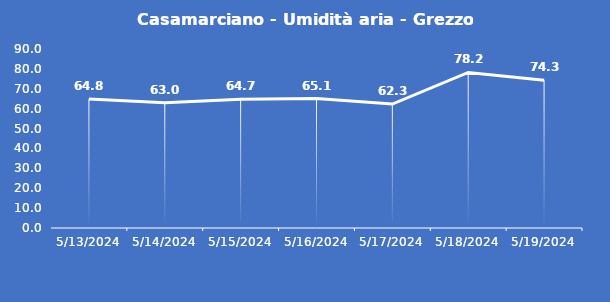
| Category | Casamarciano - Umidità aria - Grezzo (%) |
|---|---|
| 5/13/24 | 64.8 |
| 5/14/24 | 63 |
| 5/15/24 | 64.7 |
| 5/16/24 | 65.1 |
| 5/17/24 | 62.3 |
| 5/18/24 | 78.2 |
| 5/19/24 | 74.3 |